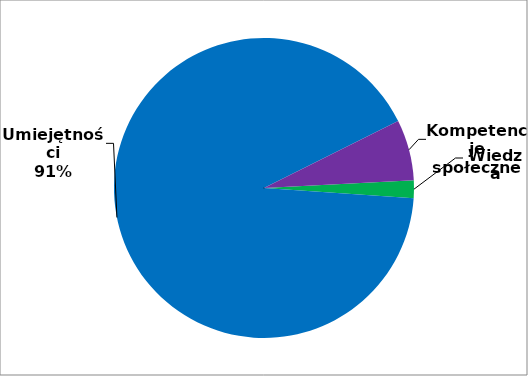
| Category | Series 0 |
|---|---|
| 0 | 12 |
| 1 | 573 |
| 2 | 41 |